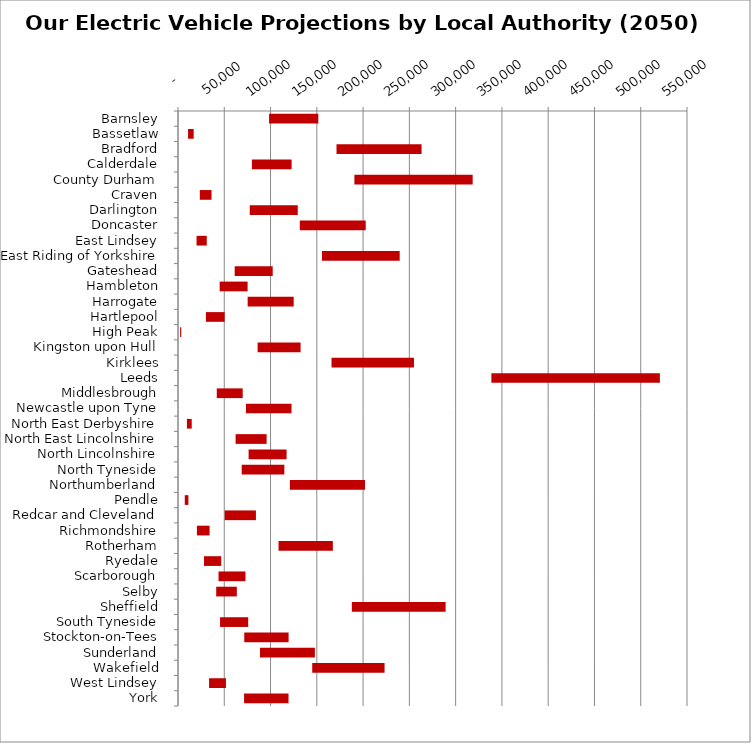
| Category | MIN | MAX |
|---|---|---|
| Barnsley | 98402 | 53207 |
| Bassetlaw | 10879 | 6045 |
| Bradford | 171277 | 91914 |
| Calderdale | 79862 | 42888 |
| County Durham | 190600 | 127810 |
| Craven | 23568 | 12649 |
| Darlington | 77533 | 51856 |
| Doncaster | 131600 | 71239 |
| East Lindsey | 20047 | 11041 |
| East Riding of Yorkshire | 155555 | 83993 |
| Gateshead | 61257 | 41077 |
| Hambleton | 45018 | 30186 |
| Harrogate | 75274 | 49740 |
| Hartlepool | 30182 | 20206 |
| High Peak | 2279 | 1234 |
| Kingston upon Hull | 86024 | 46442 |
| Kirklees | 165888 | 89096 |
| Leeds | 338625 | 182064 |
| Middlesbrough | 41895 | 28024 |
| Newcastle upon Tyne | 73443 | 49231 |
| North East Derbyshire | 9639 | 5191 |
| North East Lincolnshire | 62234 | 33524 |
| North Lincolnshire | 76293 | 41048 |
| North Tyneside | 68830 | 46090 |
| Northumberland | 120900 | 81183 |
| Pendle | 7312 | 3934 |
| Redcar and Cleveland | 50462 | 33746 |
| Richmondshire | 20446 | 13705 |
| Rotherham | 108619 | 58705 |
| Ryedale | 28067 | 18643 |
| Scarborough | 43792 | 29137 |
| Selby | 41281 | 22278 |
| Sheffield | 187844 | 101331 |
| South Tyneside | 45427 | 30454 |
| Stockton-on-Tees | 71603 | 47913 |
| Sunderland | 88570 | 59355 |
| Wakefield | 145033 | 78158 |
| West Lindsey | 33558 | 18254 |
| York | 71402 | 48032 |